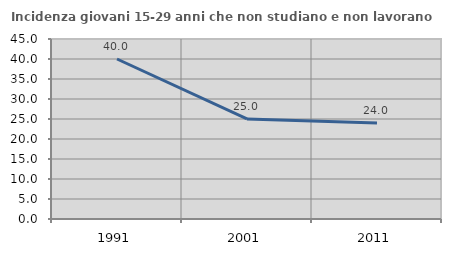
| Category | Incidenza giovani 15-29 anni che non studiano e non lavorano  |
|---|---|
| 1991.0 | 40 |
| 2001.0 | 25.015 |
| 2011.0 | 23.995 |